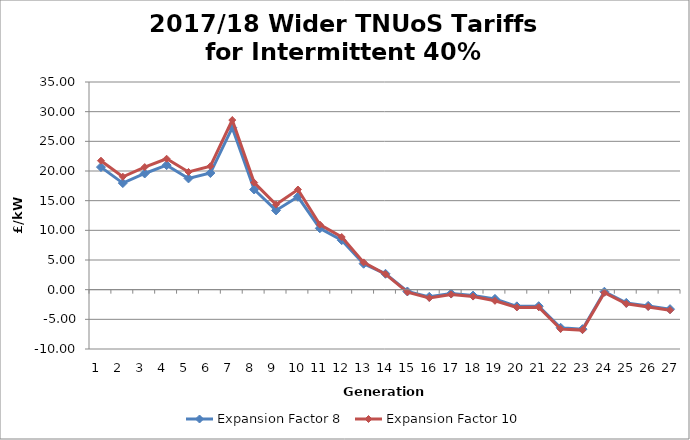
| Category | Expansion Factor 8 | Expansion Factor 10 |
|---|---|---|
| 1.0 | 20.659 | 21.738 |
| 2.0 | 17.962 | 19.031 |
| 3.0 | 19.58 | 20.663 |
| 4.0 | 20.984 | 22.068 |
| 5.0 | 18.749 | 19.841 |
| 6.0 | 19.658 | 20.808 |
| 7.0 | 27.307 | 28.586 |
| 8.0 | 16.881 | 18.05 |
| 9.0 | 13.357 | 14.336 |
| 10.0 | 15.656 | 16.881 |
| 11.0 | 10.342 | 10.969 |
| 12.0 | 8.339 | 8.872 |
| 13.0 | 4.372 | 4.598 |
| 14.0 | 2.68 | 2.605 |
| 15.0 | -0.307 | -0.418 |
| 16.0 | -1.208 | -1.404 |
| 17.0 | -0.658 | -0.8 |
| 18.0 | -0.995 | -1.158 |
| 19.0 | -1.557 | -1.881 |
| 20.0 | -2.811 | -2.987 |
| 21.0 | -2.787 | -2.962 |
| 22.0 | -6.423 | -6.625 |
| 23.0 | -6.656 | -6.814 |
| 24.0 | -0.348 | -0.505 |
| 25.0 | -2.228 | -2.392 |
| 26.0 | -2.735 | -2.903 |
| 27.0 | -3.282 | -3.452 |